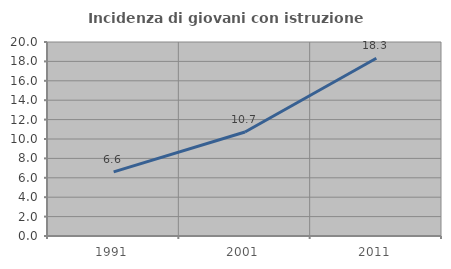
| Category | Incidenza di giovani con istruzione universitaria |
|---|---|
| 1991.0 | 6.614 |
| 2001.0 | 10.722 |
| 2011.0 | 18.33 |